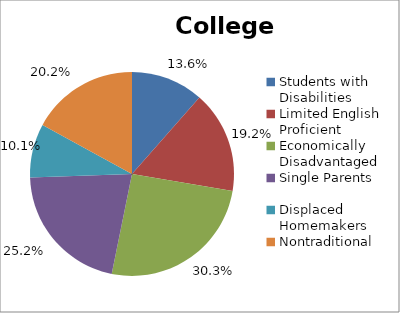
| Category | Series 0 |
|---|---|
| Students with Disabilities | 0.136 |
| Limited English Proficient | 0.192 |
| Economically Disadvantaged | 0.303 |
| Single Parents | 0.252 |
| Displaced Homemakers | 0.101 |
| Nontraditional | 0.202 |